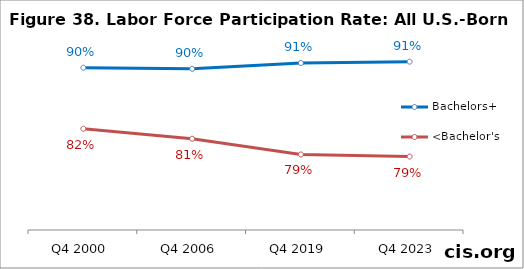
| Category | Bachelors+ | <Bachelor's |
|---|---|---|
| Q4 2000 | 0.9 | 0.825 |
| Q4 2006 | 0.898 | 0.812 |
| Q4 2019 | 0.906 | 0.793 |
| Q4 2023 | 0.907 | 0.791 |